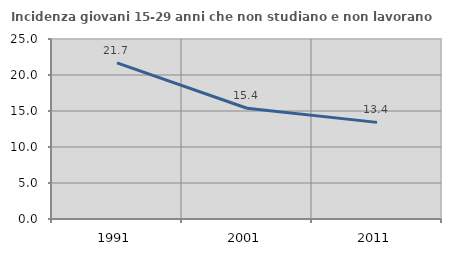
| Category | Incidenza giovani 15-29 anni che non studiano e non lavorano  |
|---|---|
| 1991.0 | 21.678 |
| 2001.0 | 15.385 |
| 2011.0 | 13.42 |